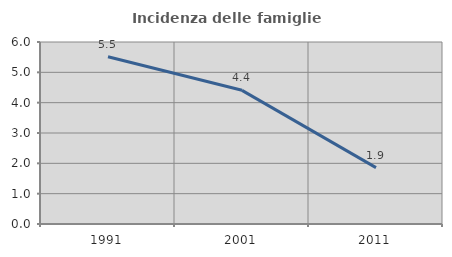
| Category | Incidenza delle famiglie numerose |
|---|---|
| 1991.0 | 5.513 |
| 2001.0 | 4.407 |
| 2011.0 | 1.857 |